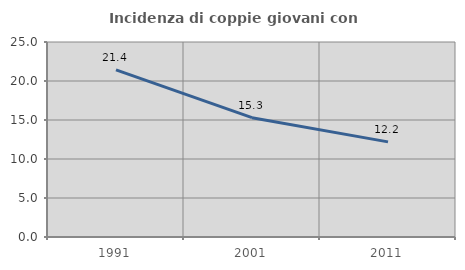
| Category | Incidenza di coppie giovani con figli |
|---|---|
| 1991.0 | 21.429 |
| 2001.0 | 15.294 |
| 2011.0 | 12.195 |